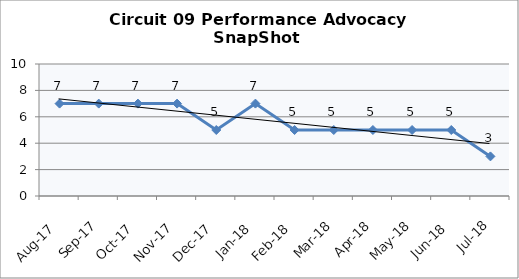
| Category | Circuit 09 |
|---|---|
| Aug-17 | 7 |
| Sep-17 | 7 |
| Oct-17 | 7 |
| Nov-17 | 7 |
| Dec-17 | 5 |
| Jan-18 | 7 |
| Feb-18 | 5 |
| Mar-18 | 5 |
| Apr-18 | 5 |
| May-18 | 5 |
| Jun-18 | 5 |
| Jul-18 | 3 |